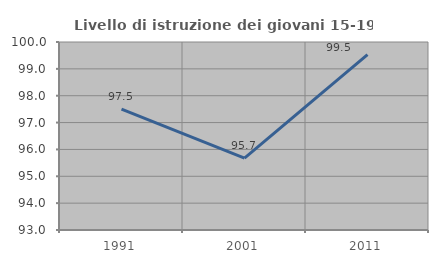
| Category | Livello di istruzione dei giovani 15-19 anni |
|---|---|
| 1991.0 | 97.5 |
| 2001.0 | 95.679 |
| 2011.0 | 99.531 |